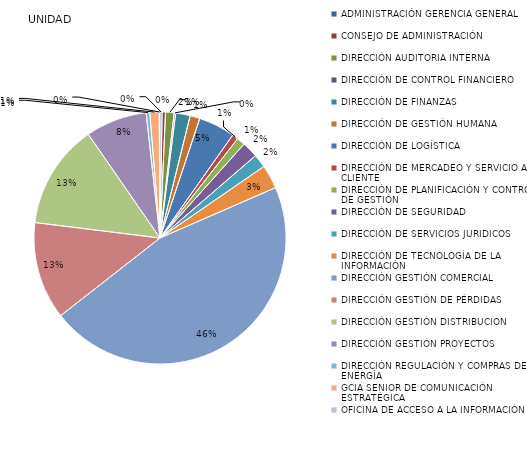
| Category | Series 0 |
|---|---|
| ADMINISTRACIÓN GERENCIA GENERAL | 8 |
| CONSEJO DE ADMINISTRACIÓN | 13 |
| DIRECCIÓN AUDITORIA INTERNA | 33 |
| DIRECCIÓN DE CONTROL FINANCIERO | 6 |
| DIRECCIÓN DE FINANZAS | 56 |
| DIRECCIÓN DE GESTIÓN HUMANA | 38 |
| DIRECCIÓN DE LOGÍSTICA | 141 |
| DIRECCIÓN DE MERCADEO Y SERVICIO AL CLIENTE | 23 |
| DIRECCIÓN DE PLANIFICACIÓN Y CONTROL DE GESTIÓN | 32 |
| DIRECCIÓN DE SEGURIDAD | 62 |
| DIRECCIÓN DE SERVICIOS JURIDICOS | 52 |
| DIRECCIÓN DE TECNOLOGÍA DE LA INFORMACIÓN | 92 |
| DIRECCIÓN GESTIÓN COMERCIAL | 1385 |
| DIRECCIÓN GESTIÓN DE PÉRDIDAS | 377 |
| DIRECCIÓN GESTIÓN DISTRIBUCION | 404 |
| DIRECCIÓN GESTIÓN PROYECTOS | 237 |
| DIRECCIÓN REGULACIÓN Y COMPRAS DE ENERGÍA | 14 |
| GCIA SENIOR DE COMUNICACIÓN ESTRATÉGICA | 36 |
| OFICINA DE ACCESO A LA INFORMACIÓN | 3 |